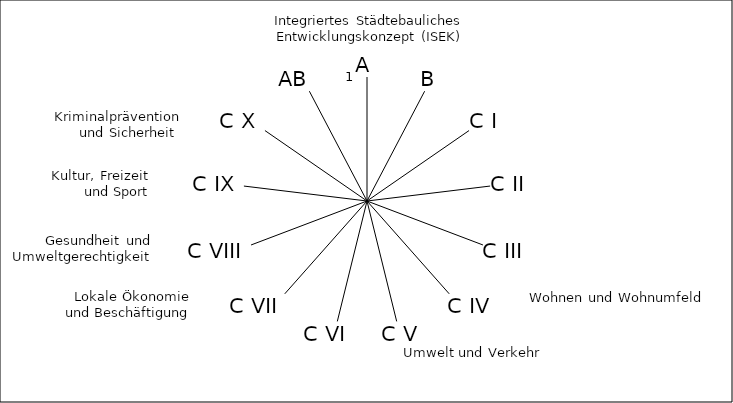
| Category | Series 0 |
|---|---|
| A | 0 |
| B | 0 |
| C I | 0 |
| C II | 0 |
| C III | 0 |
| C IV | 0 |
| C V | 0 |
| C VI | 0 |
| C VII | 0 |
| C VIII | 0 |
| C IX | 0 |
| C X | 0 |
| AB | 0 |